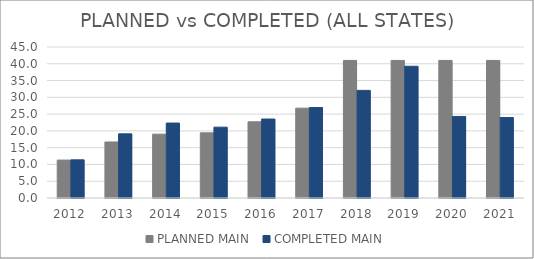
| Category | PLANNED MAIN  | COMPLETED MAIN |
|---|---|---|
| 2012.0 | 11.3 | 11.376 |
| 2013.0 | 16.696 | 19.116 |
| 2014.0 | 19.023 | 22.336 |
| 2015.0 | 19.417 | 21.11 |
| 2016.0 | 22.709 | 23.53 |
| 2017.0 | 26.775 | 26.96 |
| 2018.0 | 41 | 32.07 |
| 2019.0 | 41 | 39.26 |
| 2020.0 | 41 | 24.3 |
| 2021.0 | 41 | 23.98 |